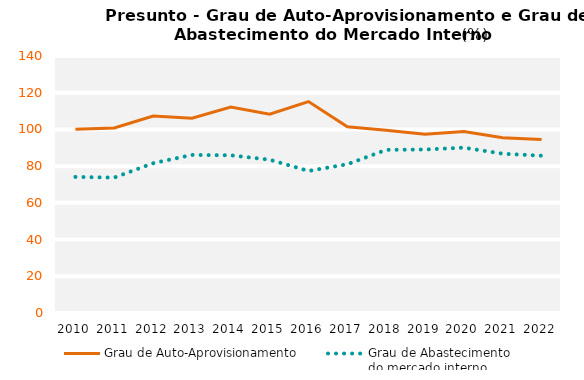
| Category | Grau de Auto-Aprovisionamento | Grau de Abastecimento
do mercado interno |
|---|---|---|
| 2010.0 | 100.055 | 74.116 |
| 2011.0 | 100.77 | 73.771 |
| 2012.0 | 107.274 | 81.594 |
| 2013.0 | 106.13 | 86.12 |
| 2014.0 | 112.24 | 85.906 |
| 2015.0 | 108.278 | 83.496 |
| 2016.0 | 115.184 | 77.389 |
| 2017.0 | 101.402 | 81.027 |
| 2018.0 | 99.539 | 88.869 |
| 2019.0 | 97.336 | 89.055 |
| 2020.0 | 98.892 | 90.073 |
| 2021.0 | 95.519 | 86.777 |
| 2022.0 | 94.465 | 85.673 |